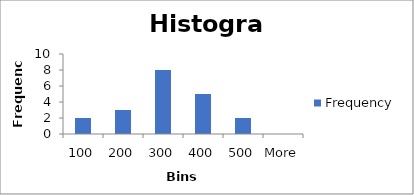
| Category | Frequency |
|---|---|
| 100 | 2 |
| 200 | 3 |
| 300 | 8 |
| 400 | 5 |
| 500 | 2 |
| More | 0 |